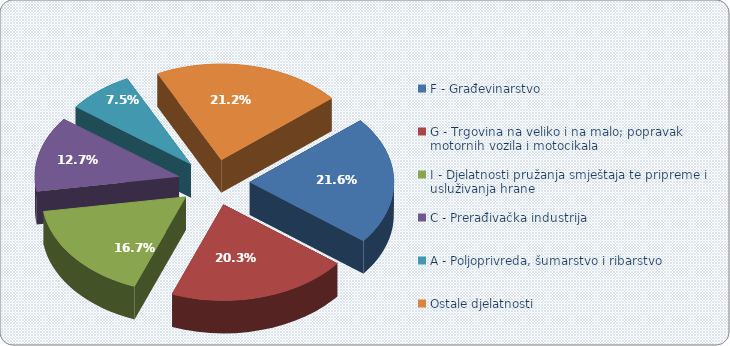
| Category | Ukupni prihodi 2020. |
|---|---|
| F - Građevinarstvo | 2133931.757 |
| G - Trgovina na veliko i na malo; popravak motornih vozila i motocikala | 2002326.501 |
| I - Djelatnosti pružanja smještaja te pripreme i usluživanja hrane  | 1652118.694 |
| C - Prerađivačka industrija | 1253000.238 |
| A - Poljoprivreda, šumarstvo i ribarstvo | 735940.645 |
| Ostale djelatnosti | 2090825.076 |